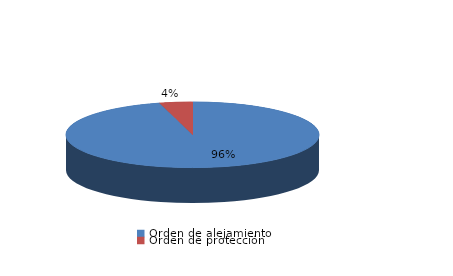
| Category | Series 0 |
|---|---|
| Orden de alejamiento | 570 |
| Orden de protección | 25 |